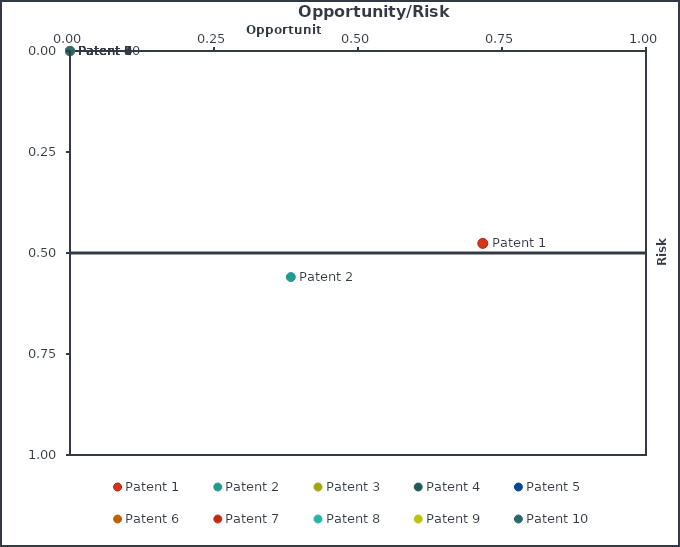
| Category | Horizontal line |
|---|---|
| 0.0 | -0.5 |
| 1.0 | -0.5 |